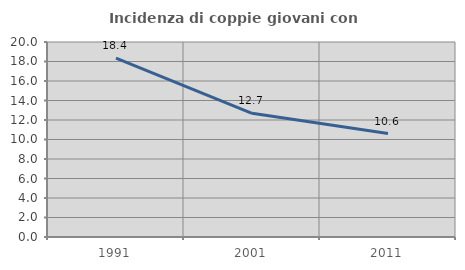
| Category | Incidenza di coppie giovani con figli |
|---|---|
| 1991.0 | 18.354 |
| 2001.0 | 12.683 |
| 2011.0 | 10.611 |